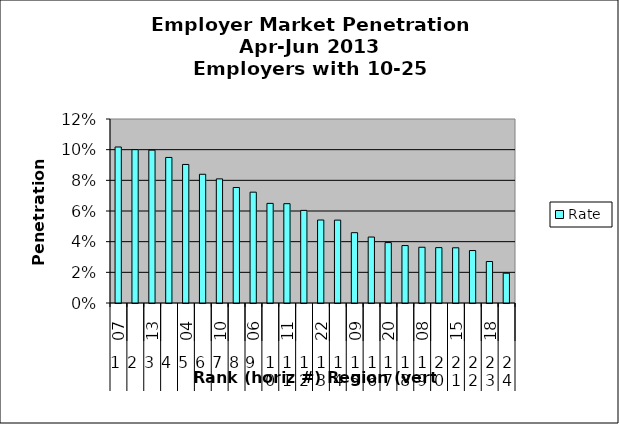
| Category | Rate |
|---|---|
| 0 | 0.102 |
| 1 | 0.1 |
| 2 | 0.1 |
| 3 | 0.095 |
| 4 | 0.09 |
| 5 | 0.084 |
| 6 | 0.081 |
| 7 | 0.075 |
| 8 | 0.072 |
| 9 | 0.065 |
| 10 | 0.065 |
| 11 | 0.06 |
| 12 | 0.054 |
| 13 | 0.054 |
| 14 | 0.046 |
| 15 | 0.043 |
| 16 | 0.039 |
| 17 | 0.037 |
| 18 | 0.036 |
| 19 | 0.036 |
| 20 | 0.036 |
| 21 | 0.034 |
| 22 | 0.027 |
| 23 | 0.019 |